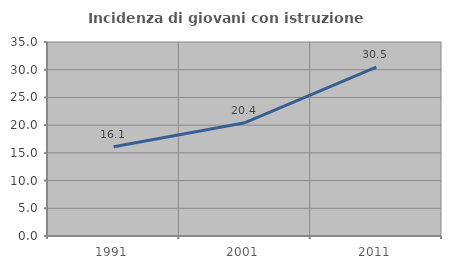
| Category | Incidenza di giovani con istruzione universitaria |
|---|---|
| 1991.0 | 16.096 |
| 2001.0 | 20.435 |
| 2011.0 | 30.459 |